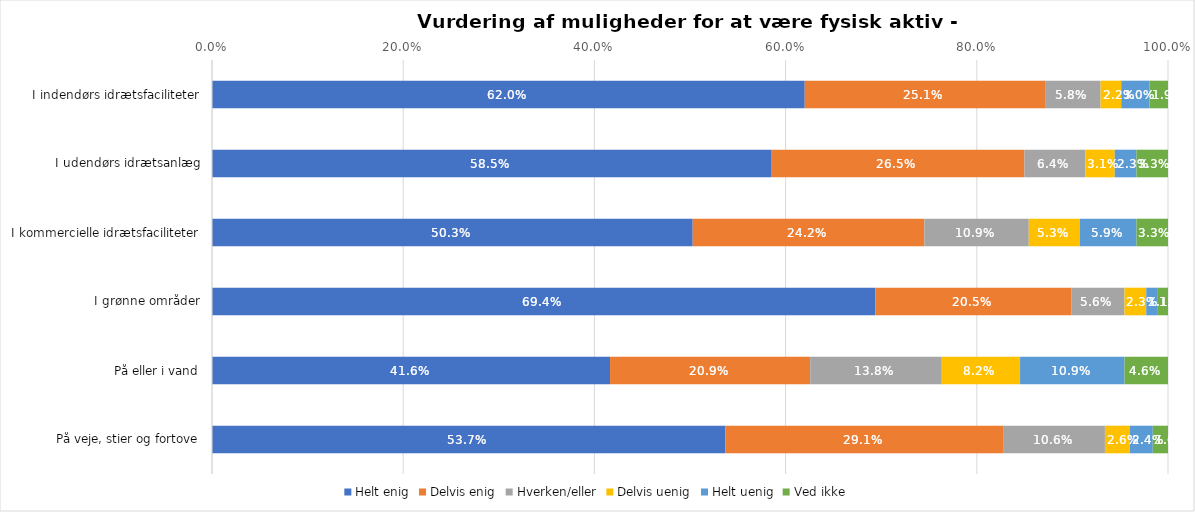
| Category | Helt enig | Delvis enig | Hverken/eller | Delvis uenig | Helt uenig | Ved ikke |
|---|---|---|---|---|---|---|
| I indendørs idrætsfaciliteter | 0.62 | 0.251 | 0.058 | 0.022 | 0.03 | 0.019 |
| I udendørs idrætsanlæg | 0.585 | 0.265 | 0.064 | 0.031 | 0.023 | 0.033 |
| I kommercielle idrætsfaciliteter | 0.503 | 0.242 | 0.109 | 0.053 | 0.059 | 0.033 |
| I grønne områder | 0.694 | 0.205 | 0.056 | 0.023 | 0.011 | 0.011 |
| På eller i vand | 0.416 | 0.209 | 0.138 | 0.082 | 0.109 | 0.046 |
| På veje, stier og fortove | 0.537 | 0.291 | 0.106 | 0.026 | 0.024 | 0.016 |